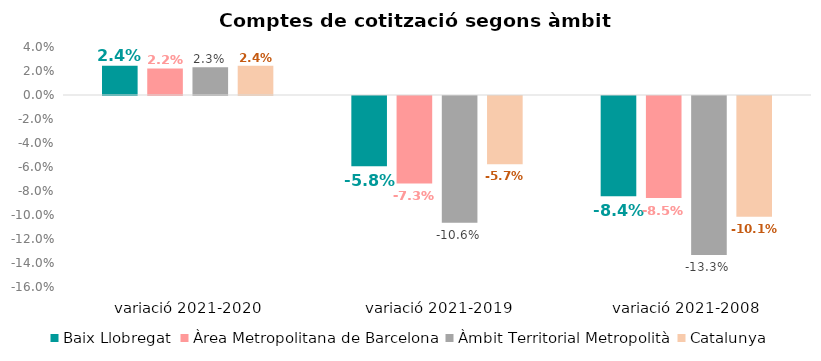
| Category | Baix Llobregat | Àrea Metropolitana de Barcelona | Àmbit Territorial Metropolità | Catalunya |
|---|---|---|---|---|
| variació 2021-2020 | 0.024 | 0.022 | 0.023 | 0.024 |
|  variació 2021-2019 | -0.058 | -0.073 | -0.106 | -0.057 |
| variació 2021-2008 | -0.084 | -0.085 | -0.133 | -0.101 |